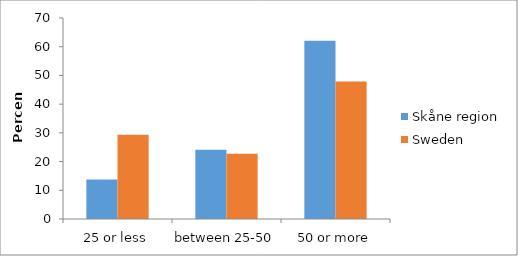
| Category | Skåne region | Sweden |
|---|---|---|
| 25 or less | 13.793 | 29.341 |
| between 25-50 | 24.138 | 22.754 |
| 50 or more | 62.069 | 47.904 |